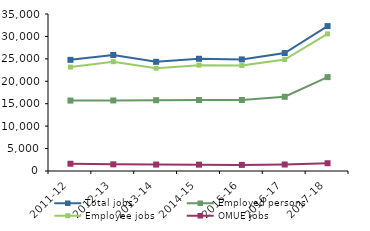
| Category | Total jobs | Employed persons | Employee jobs | OMUE jobs |
|---|---|---|---|---|
| 2011-12 | 24778 | 15699 | 23160 | 1615 |
| 2012-13 | 25862 | 15725 | 24373 | 1490 |
| 2013-14 | 24343 | 15784 | 22908 | 1434 |
| 2014-15 | 25017 | 15819 | 23600 | 1415 |
| 2015-16 | 24879 | 15828 | 23512 | 1365 |
| 2016-17 | 26290 | 16545 | 24842 | 1448 |
| 2017-18 | 32303 | 20927 | 30572 | 1733 |